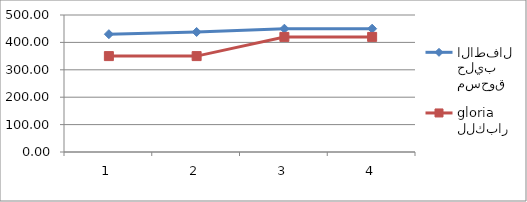
| Category | مسحوق حليب الاطفال | مسحوق حليب للكبار gloria |
|---|---|---|
| 0 | 430 | 350 |
| 1 | 438 | 350 |
| 2 | 450 | 420 |
| 3 | 450 | 420 |